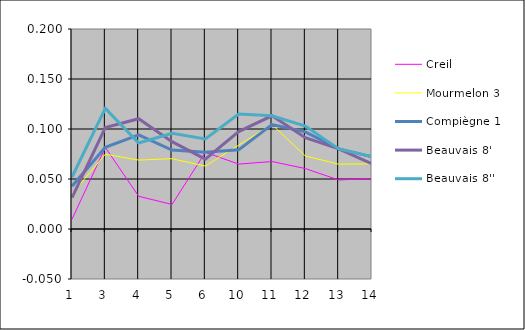
| Category | Creil | Mourmelon 3 | Compiègne 1 | Beauvais 8' | Beauvais 8'' |
|---|---|---|---|---|---|
| 1.0 | 0.01 | 0.035 | 0.043 | 0.031 | 0.052 |
| 3.0 | 0.082 | 0.075 | 0.082 | 0.102 | 0.121 |
| 4.0 | 0.033 | 0.069 | 0.094 | 0.11 | 0.086 |
| 5.0 | 0.025 | 0.07 | 0.079 | 0.087 | 0.096 |
| 6.0 | 0.077 | 0.063 | 0.077 | 0.07 | 0.09 |
| 10.0 | 0.065 | 0.084 | 0.079 | 0.097 | 0.115 |
| 11.0 | 0.067 | 0.104 | 0.104 | 0.113 | 0.113 |
| 12.0 | 0.06 | 0.073 | 0.097 | 0.091 | 0.103 |
| 13.0 | 0.049 | 0.065 | 0.08 | 0.08 | 0.08 |
| 14.0 | 0.05 | 0.065 | 0.072 | 0.065 | 0.072 |